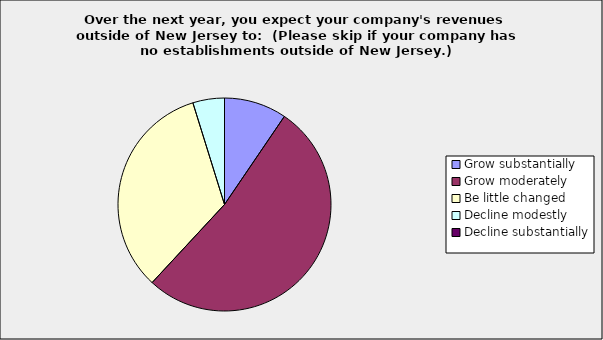
| Category | Series 0 |
|---|---|
| Grow substantially | 0.095 |
| Grow moderately | 0.524 |
| Be little changed | 0.333 |
| Decline modestly | 0.048 |
| Decline substantially | 0 |